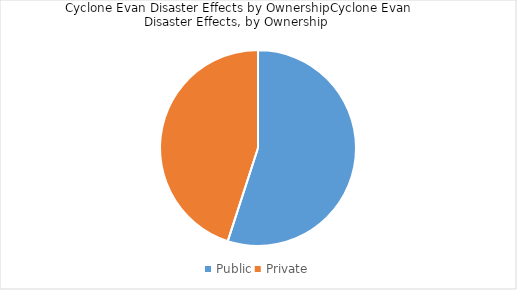
| Category | Series 0 |
|---|---|
| Public | 0.55 |
| Private | 0.45 |